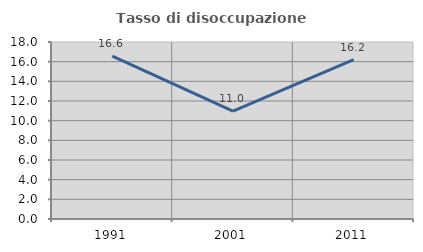
| Category | Tasso di disoccupazione giovanile  |
|---|---|
| 1991.0 | 16.568 |
| 2001.0 | 10.976 |
| 2011.0 | 16.197 |